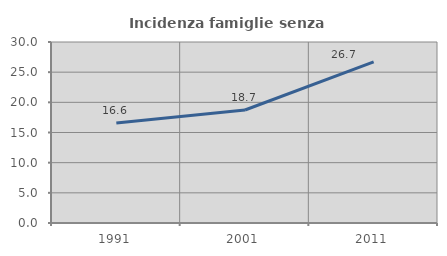
| Category | Incidenza famiglie senza nuclei |
|---|---|
| 1991.0 | 16.567 |
| 2001.0 | 18.733 |
| 2011.0 | 26.712 |